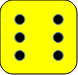
| Category | Series 0 |
|---|---|
| 0.1 | 0.1 |
| 0.1 | 0.5 |
| 0.1 | 0.9 |
| 0.9 | 0.1 |
| 0.9 | 0.5 |
| 0.9 | 0.9 |